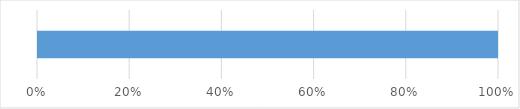
| Category | Series 0 | Series 1 | Series 2 | Series 3 | Series 4 |
|---|---|---|---|---|---|
| 0 | 0 | 0 | 0 | 0 | 18 |